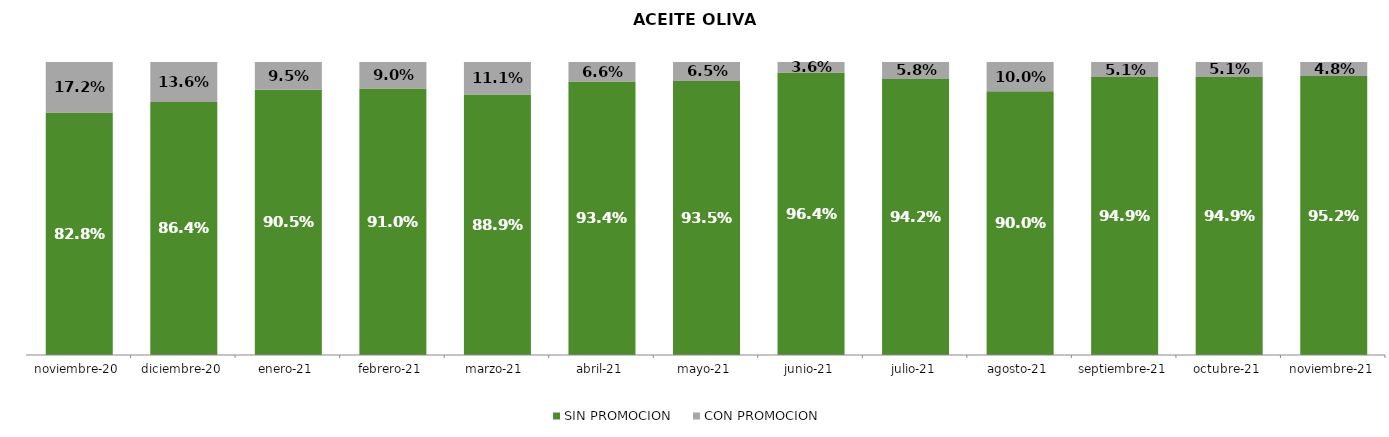
| Category | SIN PROMOCION   | CON PROMOCION   |
|---|---|---|
| 2020-11-01 | 0.828 | 0.172 |
| 2020-12-01 | 0.864 | 0.136 |
| 2021-01-01 | 0.905 | 0.095 |
| 2021-02-01 | 0.91 | 0.09 |
| 2021-03-01 | 0.889 | 0.111 |
| 2021-04-01 | 0.934 | 0.066 |
| 2021-05-01 | 0.935 | 0.065 |
| 2021-06-01 | 0.964 | 0.036 |
| 2021-07-01 | 0.942 | 0.058 |
| 2021-08-01 | 0.9 | 0.1 |
| 2021-09-01 | 0.949 | 0.051 |
| 2021-10-01 | 0.949 | 0.051 |
| 2021-11-01 | 0.952 | 0.048 |